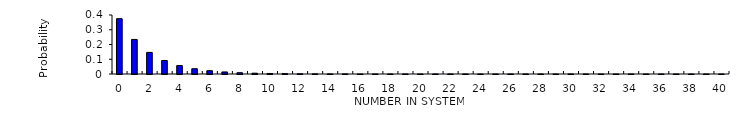
| Category | Series 0 |
|---|---|
| 0.0 | 0.375 |
| 1.0 | 0.234 |
| 2.0 | 0.146 |
| 3.0 | 0.092 |
| 4.0 | 0.057 |
| 5.0 | 0.036 |
| 6.0 | 0.022 |
| 7.0 | 0.014 |
| 8.0 | 0.009 |
| 9.0 | 0.005 |
| 10.0 | 0.003 |
| 11.0 | 0.002 |
| 12.0 | 0.001 |
| 13.0 | 0.001 |
| 14.0 | 0.001 |
| 15.0 | 0 |
| 16.0 | 0 |
| 17.0 | 0 |
| 18.0 | 0 |
| 19.0 | 0 |
| 20.0 | 0 |
| 21.0 | 0 |
| 22.0 | 0 |
| 23.0 | 0 |
| 24.0 | 0 |
| 25.0 | 0 |
| 26.0 | 0 |
| 27.0 | 0 |
| 28.0 | 0 |
| 29.0 | 0 |
| 30.0 | 0 |
| 31.0 | 0 |
| 32.0 | 0 |
| 33.0 | 0 |
| 34.0 | 0 |
| 35.0 | 0 |
| 36.0 | 0 |
| 37.0 | 0 |
| 38.0 | 0 |
| 39.0 | 0 |
| 40.0 | 0 |